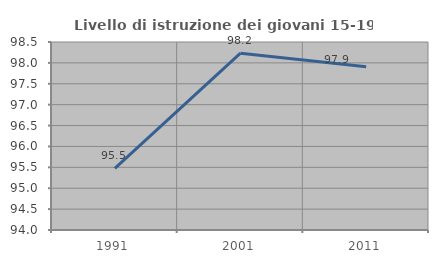
| Category | Livello di istruzione dei giovani 15-19 anni |
|---|---|
| 1991.0 | 95.476 |
| 2001.0 | 98.232 |
| 2011.0 | 97.905 |